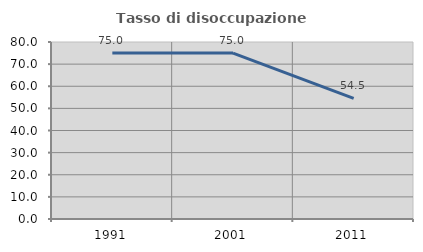
| Category | Tasso di disoccupazione giovanile  |
|---|---|
| 1991.0 | 75 |
| 2001.0 | 75 |
| 2011.0 | 54.545 |